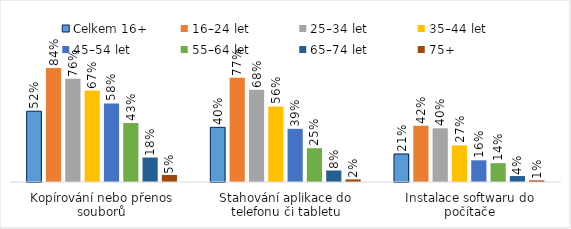
| Category | Celkem 16+ | 16–24 let | 25–34 let | 35–44 let | 45–54 let | 55–64 let | 65–74 let | 75+ |
|---|---|---|---|---|---|---|---|---|
| Kopírování nebo přenos souborů | 0.522 | 0.842 | 0.762 | 0.675 | 0.58 | 0.435 | 0.181 | 0.052 |
| Stahování aplikace do telefonu či tabletu | 0.403 | 0.77 | 0.681 | 0.558 | 0.392 | 0.249 | 0.085 | 0.019 |
| Instalace softwaru do počítače | 0.207 | 0.415 | 0.396 | 0.27 | 0.16 | 0.139 | 0.044 | 0.012 |